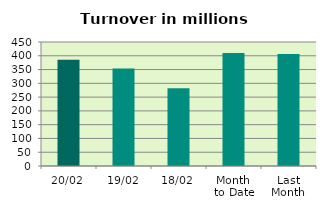
| Category | Series 0 |
|---|---|
| 20/02 | 385.698 |
| 19/02 | 354.229 |
| 18/02 | 282.545 |
| Month 
to Date | 409.729 |
| Last
Month | 406.6 |